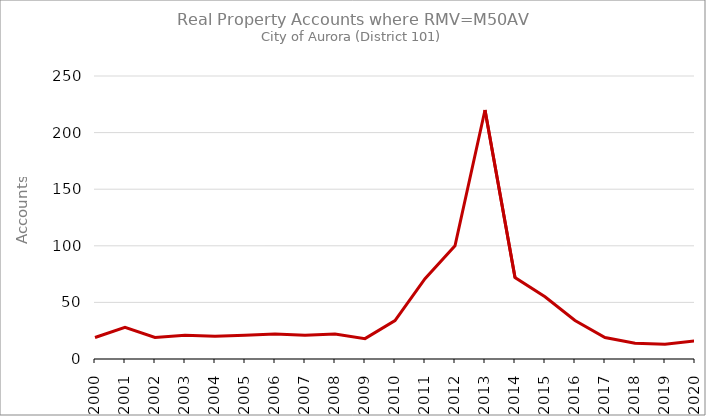
| Category | Series 0 |
|---|---|
| 2000.0 | 19 |
| 2001.0 | 28 |
| 2002.0 | 19 |
| 2003.0 | 21 |
| 2004.0 | 20 |
| 2005.0 | 21 |
| 2006.0 | 22 |
| 2007.0 | 21 |
| 2008.0 | 22 |
| 2009.0 | 18 |
| 2010.0 | 34 |
| 2011.0 | 71 |
| 2012.0 | 100 |
| 2013.0 | 220 |
| 2014.0 | 72 |
| 2015.0 | 55 |
| 2016.0 | 34 |
| 2017.0 | 19 |
| 2018.0 | 14 |
| 2019.0 | 13 |
| 2020.0 | 16 |